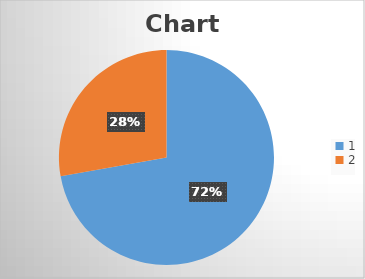
| Category | Series 0 |
|---|---|
| 0 | 13 |
| 1 | 5 |